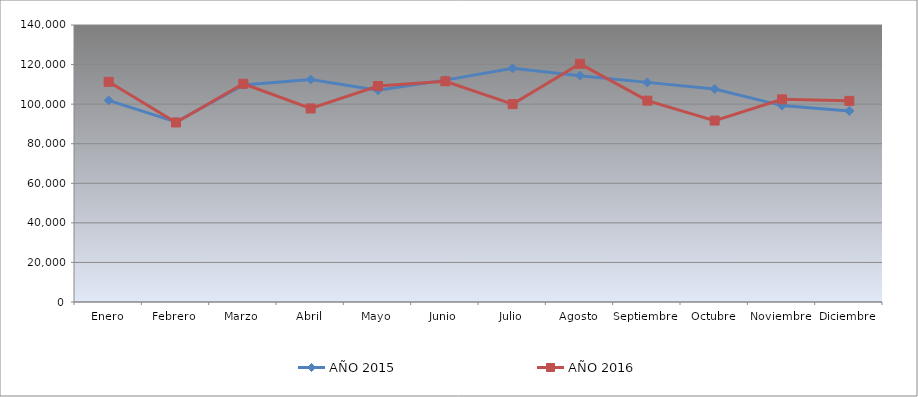
| Category | AÑO 2015 | AÑO 2016 |
|---|---|---|
| Enero | 101920 | 111280 |
| Febrero | 90980 | 90740 |
| Marzo | 109720 | 110300 |
| Abril | 112440 | 97820 |
| Mayo | 107060 | 109160 |
| Junio | 112140 | 111540 |
| Julio | 118140 | 100020 |
| Agosto | 114400 | 120380 |
| Septiembre | 111000 | 101760 |
| Octubre | 107660 | 91700 |
| Noviembre | 99260 | 102420 |
| Diciembre | 96560 | 101660 |